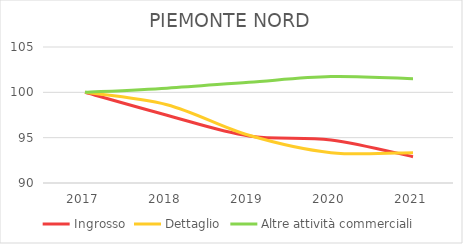
| Category | Ingrosso | Dettaglio | Altre attività commerciali |
|---|---|---|---|
| 2017.0 | 100 | 100 | 100 |
| 2018.0 | 97.475 | 98.638 | 100.462 |
| 2019.0 | 95.194 | 95.26 | 101.117 |
| 2020.0 | 94.75 | 93.345 | 101.733 |
| 2021.0 | 92.899 | 93.345 | 101.502 |